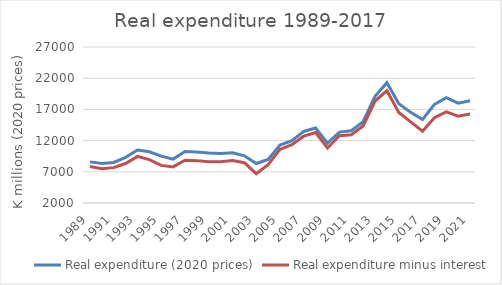
| Category | Real expenditure (2020 prices) | Real expenditure minus interest |
|---|---|---|
| 1989.0 | 8590.606 | 7846.267 |
| 1990.0 | 8338.381 | 7506.916 |
| 1991.0 | 8501.812 | 7667.951 |
| 1992.0 | 9320.473 | 8325.502 |
| 1993.0 | 10492.104 | 9456.686 |
| 1994.0 | 10203.61 | 8960.492 |
| 1995.0 | 9510.273 | 8030.356 |
| 1996.0 | 9032.893 | 7784.851 |
| 1997.0 | 10237.929 | 8848.089 |
| 1998.0 | 10176.587 | 8790.216 |
| 1999.0 | 10020.987 | 8616.196 |
| 2000.0 | 9921.987 | 8595.631 |
| 2001.0 | 10035.75 | 8809.668 |
| 2002.0 | 9559.898 | 8454.573 |
| 2003.0 | 8333.39 | 6700.448 |
| 2004.0 | 8967.782 | 8152.686 |
| 2005.0 | 11294.304 | 10587.654 |
| 2006.0 | 11980.109 | 11343.333 |
| 2007.0 | 13468.23 | 12707.502 |
| 2008.0 | 14009.442 | 13302.459 |
| 2009.0 | 11603.37 | 10823.936 |
| 2010.0 | 13360.322 | 12777.379 |
| 2011.0 | 13576.578 | 12918.52 |
| 2012.0 | 15035.517 | 14351.582 |
| 2013.0 | 19094.887 | 18339.688 |
| 2014.0 | 21285.153 | 19999.981 |
| 2015.0 | 17916.65 | 16520.236 |
| 2016.0 | 16528.088 | 14988.471 |
| 2017.0 | 15389.336 | 13501.572 |
| 2018.0 | 17804.219 | 15669.262 |
| 2019.0 | 18870.092 | 16600.502 |
| 2020.0 | 17989.3 | 15924.9 |
| 2021.0 | 18376.57 | 16248.36 |